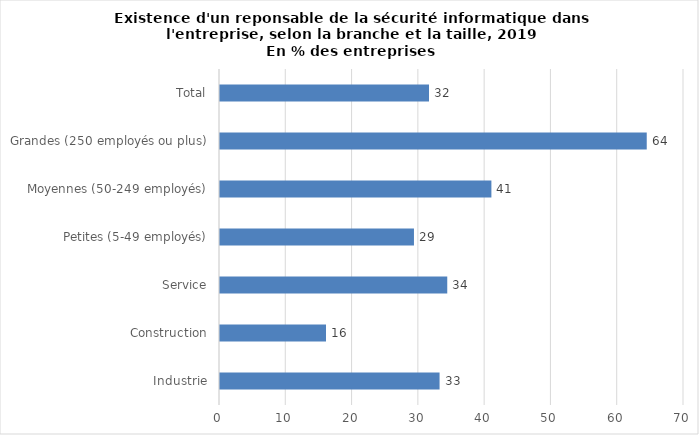
| Category | Series 0 |
|---|---|
| Industrie | 33.125 |
| Construction | 15.992 |
| Service | 34.284 |
| Petites (5-49 employés) | 29.262 |
| Moyennes (50-249 employés) | 40.944 |
| Grandes (250 employés ou plus) | 64.379 |
| Total | 31.531 |